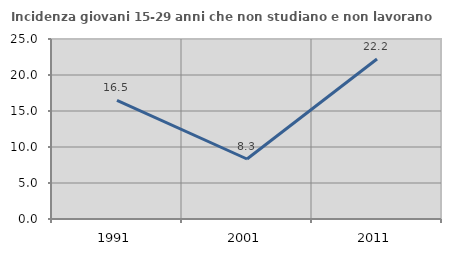
| Category | Incidenza giovani 15-29 anni che non studiano e non lavorano  |
|---|---|
| 1991.0 | 16.463 |
| 2001.0 | 8.333 |
| 2011.0 | 22.222 |